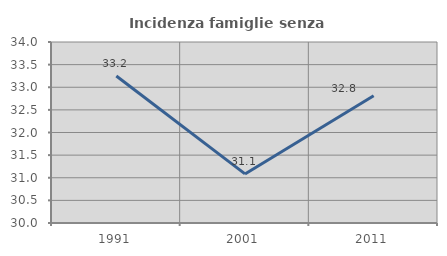
| Category | Incidenza famiglie senza nuclei |
|---|---|
| 1991.0 | 33.248 |
| 2001.0 | 31.085 |
| 2011.0 | 32.812 |